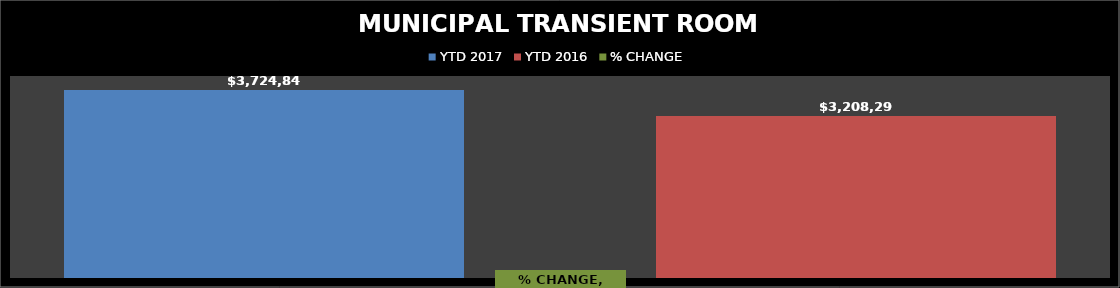
| Category | YTD 2017 | YTD 2016 |
|---|---|---|
| Restaurant Tax Distribution - 2017 | 3724840.68 | 3208298.29 |